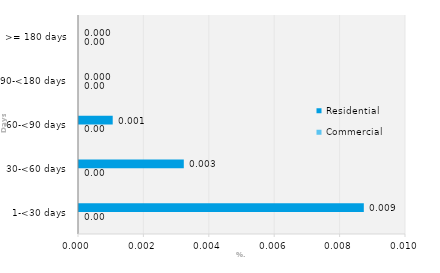
| Category | Commercial | Residential |
|---|---|---|
| 1-<30 days | 0 | 0.009 |
| 30-<60 days | 0 | 0.003 |
| 60-<90 days | 0 | 0.001 |
| 90-<180 days | 0 | 0 |
| >= 180 days | 0 | 0 |